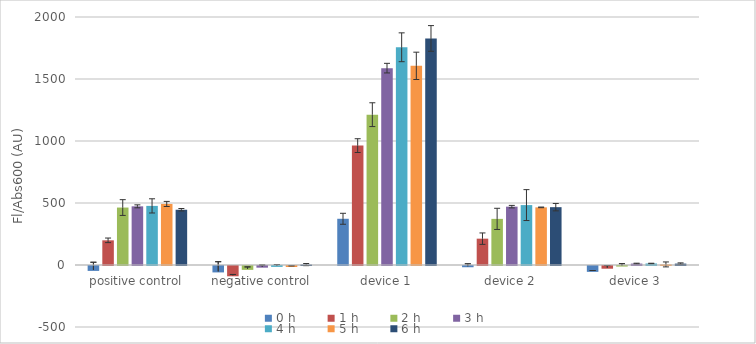
| Category | 0 h | 1 h | 2 h | 3 h | 4 h | 5 h | 6 h |
|---|---|---|---|---|---|---|---|
| positive control | -39.548 | 199.017 | 463.342 | 473.097 | 476.699 | 492.275 | 445.686 |
| negative control | -51.754 | -83.04 | -31.122 | -13.463 | -7.175 | -8.212 | 3.29 |
| device 1 | 372.8 | 962.745 | 1212.328 | 1587.58 | 1755.844 | 1606.051 | 1827.086 |
| device 2 | -10.009 | 212.395 | 371.99 | 470.556 | 483.205 | 464.799 | 466.417 |
| device 3 | -47.254 | -21.847 | -4.459 | 11.464 | 12.253 | 4.65 | 11.214 |